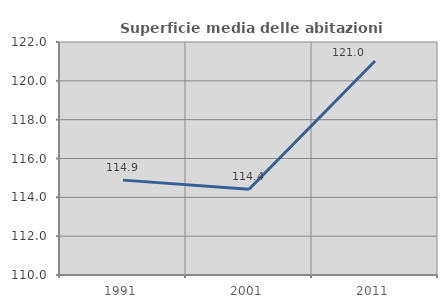
| Category | Superficie media delle abitazioni occupate |
|---|---|
| 1991.0 | 114.886 |
| 2001.0 | 114.414 |
| 2011.0 | 121.025 |